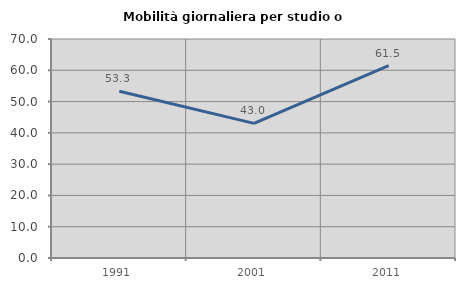
| Category | Mobilità giornaliera per studio o lavoro |
|---|---|
| 1991.0 | 53.297 |
| 2001.0 | 43.038 |
| 2011.0 | 61.486 |